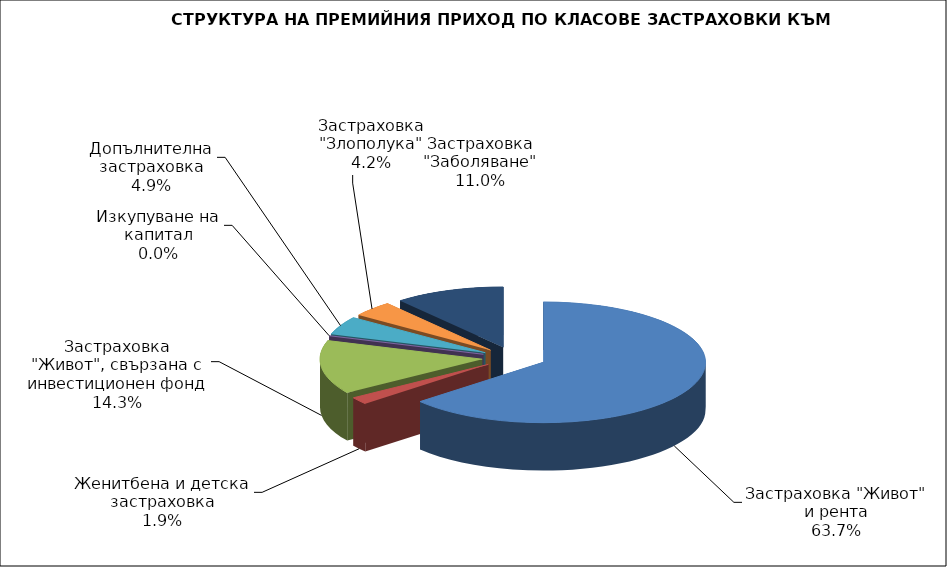
| Category | Series 0 |
|---|---|
| Застраховка "Живот" и рента | 175275971.656 |
| Женитбена и детска застраховка | 5295829.424 |
| Застраховка "Живот", свързана с инвестиционен фонд | 39443715.703 |
| Изкупуване на капитал | 0 |
| Допълнителна застраховка | 13456860.296 |
| Застраховка "Злополука" | 11443822.94 |
| Застраховка "Заболяване" | 30148691.1 |